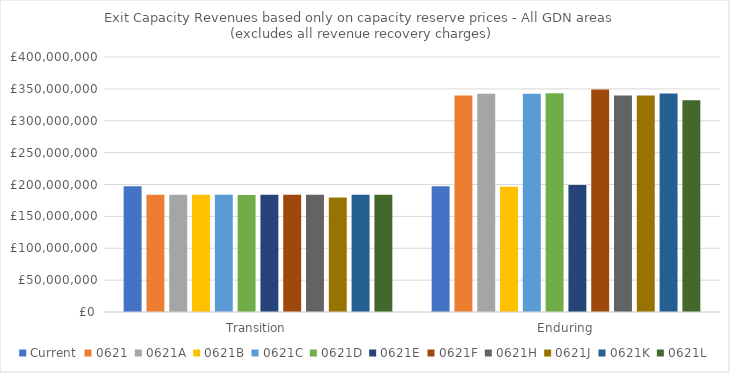
| Category | Current | 0621 | 0621A | 0621B | 0621C | 0621D | 0621E | 0621F | 0621H | 0621J | 0621K | 0621L |
|---|---|---|---|---|---|---|---|---|---|---|---|---|
| Transition | 197443761.028 | 184036611.079 | 184036611.079 | 184036611.079 | 184036611.079 | 183391167.913 | 184036611.079 | 184036611.079 | 184036611.079 | 179435239.741 | 184036611.079 | 184036611.079 |
| Enduring | 197443761.028 | 339721241.882 | 342344779.797 | 196458221.083 | 342344779.797 | 343193215.844 | 199337452.801 | 349128926.478 | 339721241.882 | 339737721.382 | 342874682.695 | 332064675.638 |